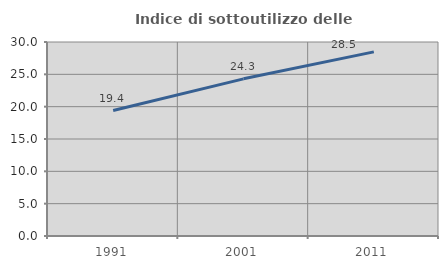
| Category | Indice di sottoutilizzo delle abitazioni  |
|---|---|
| 1991.0 | 19.396 |
| 2001.0 | 24.304 |
| 2011.0 | 28.477 |